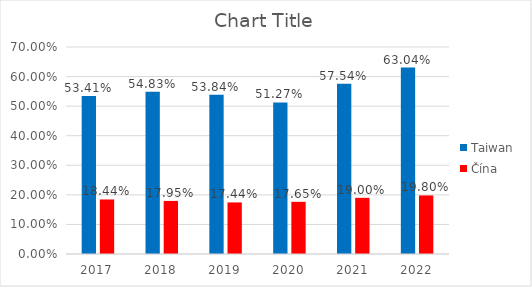
| Category | Taiwan | Čína |
|---|---|---|
| 2017.0 | 0.534 | 0.184 |
| 2018.0 | 0.548 | 0.18 |
| 2019.0 | 0.538 | 0.174 |
| 2020.0 | 0.513 | 0.176 |
| 2021.0 | 0.575 | 0.19 |
| 2022.0 | 0.63 | 0.198 |